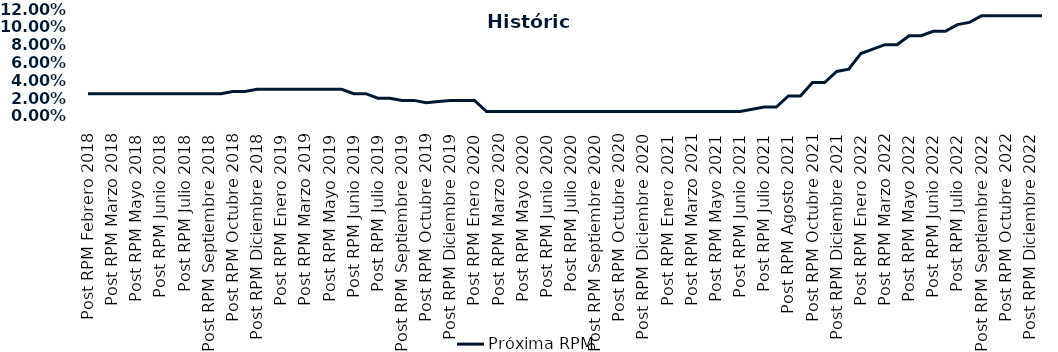
| Category | Próxima RPM |
|---|---|
| Post RPM Febrero 2018 | 0.025 |
| Pre RPM Marzo 2018 | 0.025 |
| Post RPM Marzo 2018 | 0.025 |
| Pre RPM Mayo 2018 | 0.025 |
| Post RPM Mayo 2018 | 0.025 |
| Pre RPM Junio 2018 | 0.025 |
| Post RPM Junio 2018 | 0.025 |
| Pre RPM Julio 2018 | 0.025 |
| Post RPM Julio 2018 | 0.025 |
| Pre RPM Septiembre 2018 | 0.025 |
| Post RPM Septiembre 2018 | 0.025 |
| Pre RPM Octubre 2018 | 0.025 |
| Post RPM Octubre 2018 | 0.028 |
| Pre RPM Diciembre 2018 | 0.028 |
| Post RPM Diciembre 2018 | 0.03 |
| Pre RPM Enero 2019 | 0.03 |
| Post RPM Enero 2019 | 0.03 |
| Pre RPM Marzo 2019 | 0.03 |
| Post RPM Marzo 2019 | 0.03 |
| Pre RPM Mayo 2019 | 0.03 |
| Post RPM Mayo 2019 | 0.03 |
| Pre RPM Junio 2019 | 0.03 |
| Post RPM Junio 2019 | 0.025 |
| Pre RPM Julio 2019 | 0.025 |
| Post RPM Julio 2019 | 0.02 |
| Pre RPM Septiembre 2019 | 0.02 |
| Post RPM Septiembre 2019 | 0.018 |
| Pre RPM Octubre 2019 | 0.018 |
| Post RPM Octubre 2019 | 0.015 |
| Pre RPM Diciembre 2019 | 0.016 |
| Post RPM Diciembre 2019 | 0.018 |
| Pre RPM Enero 2020 | 0.018 |
| Post RPM Enero 2020 | 0.018 |
| Pre RPM Marzo 2020 | 0.005 |
| Post RPM Marzo 2020 | 0.005 |
| Pre RPM Mayo 2020 | 0.005 |
| Post RPM Mayo 2020 | 0.005 |
| Pre RPM Junio 2020 | 0.005 |
| Post RPM Junio 2020 | 0.005 |
| Pre RPM Julio 2020 | 0.005 |
| Post RPM Julio 2020 | 0.005 |
| Pre RPM Septiembre 2020 | 0.005 |
| Post RPM Septiembre 2020 | 0.005 |
| Pre RPM Octubre 2020 | 0.005 |
| Post RPM Octubre 2020 | 0.005 |
| Pre RPM Diciembre 2020 | 0.005 |
| Post RPM Diciembre 2020 | 0.005 |
| Pre RPM Enero 2021 | 0.005 |
| Post RPM Enero 2021 | 0.005 |
| Pre RPM Marzo 2021 | 0.005 |
| Post RPM Marzo 2021 | 0.005 |
| Pre RPM Mayo 2021 | 0.005 |
| Post RPM Mayo 2021 | 0.005 |
| Pre RPM Junio 2021 | 0.005 |
| Post RPM Junio 2021 | 0.005 |
| Pre RPM Julio 2021 | 0.008 |
| Post RPM Julio 2021 | 0.01 |
| Pre RPM Agosto 2021 | 0.01 |
| Post RPM Agosto 2021 | 0.022 |
| Pre RPM Octubre 2021 | 0.022 |
| Post RPM Octubre 2021 | 0.038 |
| Pre RPM Diciembre 2021 | 0.038 |
| Post RPM Diciembre 2021 | 0.05 |
| Pre RPM Enero 2022 | 0.052 |
| Post RPM Enero 2022 | 0.07 |
| Pre RPM Marzo 2022 | 0.075 |
| Post RPM Marzo 2022 | 0.08 |
| Pre RPM Mayo 2022 | 0.08 |
| Post RPM Mayo 2022 | 0.09 |
| Pre RPM Junio 2022 | 0.09 |
| Post RPM Junio 2022 | 0.095 |
| Pre RPM Julio 2022 | 0.095 |
| Post RPM Julio 2022 | 0.102 |
| Pre RPM Septiembre 2022 | 0.105 |
| Post RPM Septiembre 2022 | 0.112 |
| Pre RPM Octubre 2022 | 0.112 |
| Post RPM Octubre 2022 | 0.112 |
| Pre RPM Diciembre 2022 | 0.112 |
| Post RPM Diciembre 2022 | 0.112 |
| Pre RPM Enero 2023 | 0.112 |